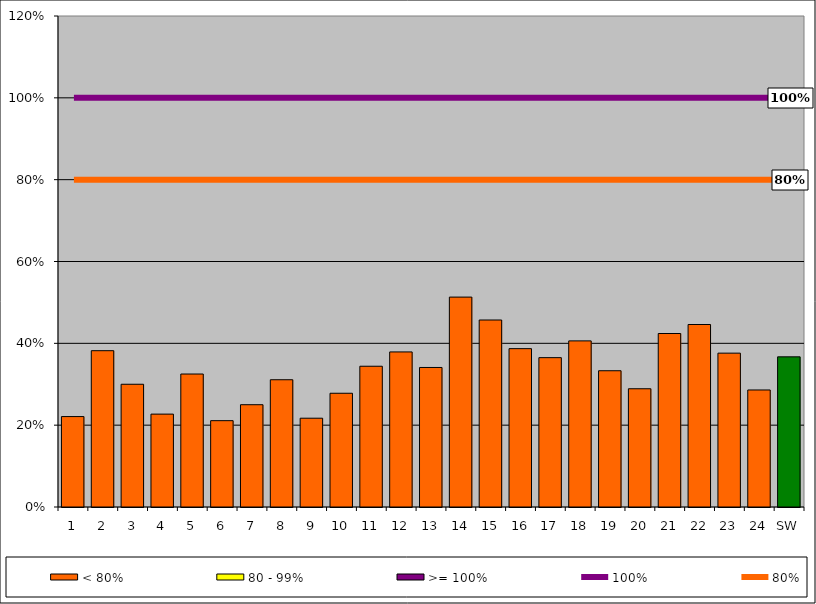
| Category | < 80% | 80 - 99% | >= 100% |
|---|---|---|---|
| 1 | 0.221 | 0 | 0 |
| 2 | 0.382 | 0 | 0 |
| 3 | 0.3 | 0 | 0 |
| 4 | 0.227 | 0 | 0 |
| 5 | 0.325 | 0 | 0 |
| 6 | 0.211 | 0 | 0 |
| 7 | 0.25 | 0 | 0 |
| 8 | 0.311 | 0 | 0 |
| 9 | 0.217 | 0 | 0 |
| 10 | 0.278 | 0 | 0 |
| 11 | 0.344 | 0 | 0 |
| 12 | 0.379 | 0 | 0 |
| 13 | 0.341 | 0 | 0 |
| 14 | 0.513 | 0 | 0 |
| 15 | 0.457 | 0 | 0 |
| 16 | 0.387 | 0 | 0 |
| 17 | 0.365 | 0 | 0 |
| 18 | 0.406 | 0 | 0 |
| 19 | 0.333 | 0 | 0 |
| 20 | 0.289 | 0 | 0 |
| 21 | 0.424 | 0 | 0 |
| 22 | 0.446 | 0 | 0 |
| 23 | 0.376 | 0 | 0 |
| 24 | 0.286 | 0 | 0 |
| SW | 0.367 | 0 | 0 |